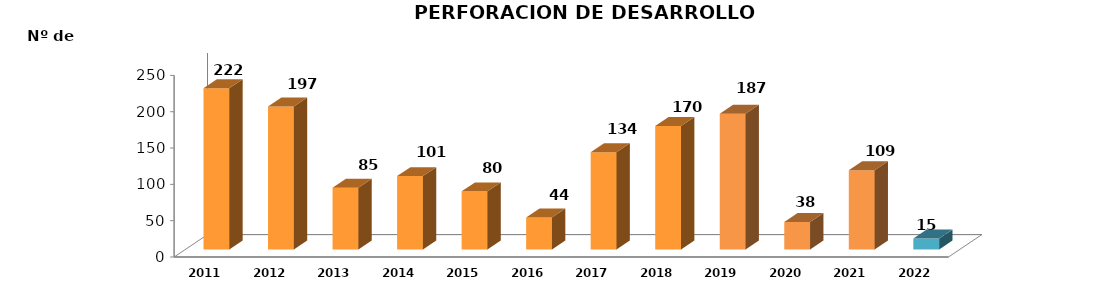
| Category | Series 0 |
|---|---|
| 2011.0 | 222 |
| 2012.0 | 197 |
| 2013.0 | 85 |
| 2014.0 | 101 |
| 2015.0 | 80 |
| 2016.0 | 44 |
| 2017.0 | 134 |
| 2018.0 | 170 |
| 2019.0 | 187 |
| 2020.0 | 38 |
| 2021.0 | 109 |
| 2022.0 | 15 |